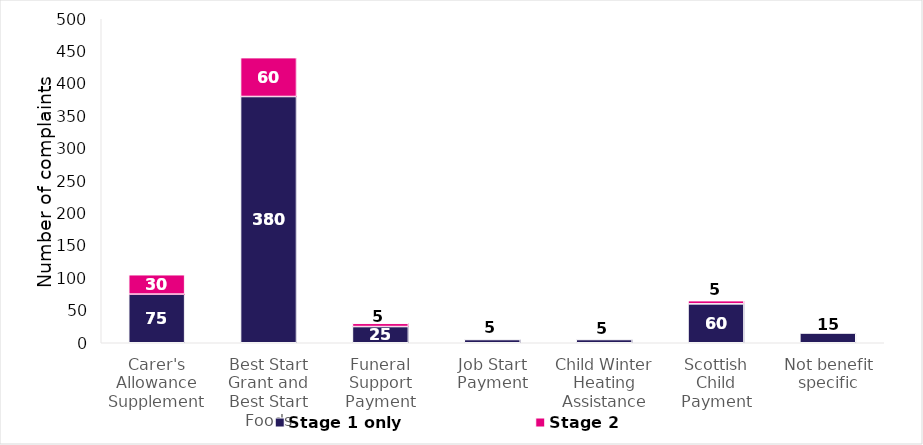
| Category | Stage 1 only | Stage 2
 |
|---|---|---|
| Carer's Allowance Supplement | 75 | 30 |
| Best Start Grant and Best Start Foods | 380 | 60 |
| Funeral Support Payment | 25 | 5 |
| Job Start Payment | 5 | 0 |
| Child Winter Heating Assistance | 5 | 0 |
| Scottish Child Payment | 60 | 5 |
| Not benefit specific | 15 | 0 |